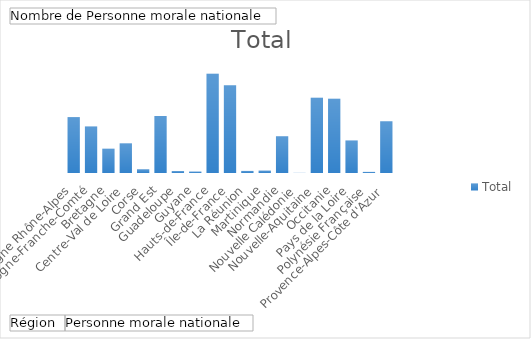
| Category | Total |
|---|---|
| Auvergne Rhône-Alpes | 403 |
| Bourgogne-Franche-Comté | 335 |
| Bretagne | 175 |
| Centre-Val de Loire | 214 |
| Corse | 27 |
| Grand Est | 411 |
| Guadeloupe | 14 |
| Guyane | 10 |
| Hauts-de-France | 715 |
| Île-de-France | 633 |
| La Réunion | 15 |
| Martinique | 17 |
| Normandie | 265 |
| Nouvelle Calédonie | 1 |
| Nouvelle-Aquitaine | 543 |
| Occitanie | 536 |
| Pays de la Loire | 234 |
| Polynésie Française | 8 |
| Provence-Alpes-Côte d'Azur | 373 |